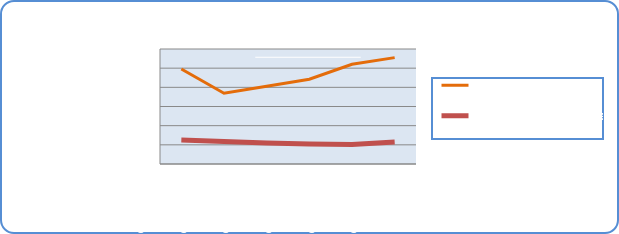
| Category | Motorin Türleri litre | Benzin Türleri litre |
|---|---|---|
| 6/3/19 | 49556859.24 | 12493515.708 |
| 6/4/19 | 36938535.581 | 11727107.789 |
| 6/5/19 | 40603422.822 | 10921177.17 |
| 6/6/19 | 44204495.866 | 10402098.311 |
| 6/7/19 | 52001257.981 | 10161631.184 |
| 6/8/19 | 55492149.885 | 11500296.574 |